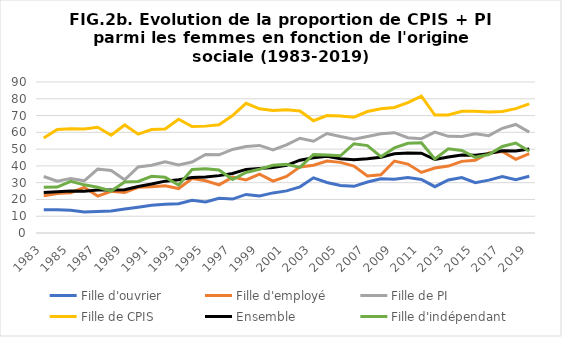
| Category | Fille d'ouvrier | Fille d'employé | Fille de PI | Fille de CPIS | Ensemble | Fille d'indépendant |
|---|---|---|---|---|---|---|
| 1983.0 | 13.8 | 22.2 | 33.7 | 56.6 | 24.1 | 27.3 |
| 1984.0 | 13.8 | 23.5 | 30.9 | 61.7 | 24.6 | 27.4 |
| 1985.0 | 13.5 | 24 | 32.5 | 62.1 | 25.1 | 30.8 |
| 1986.0 | 12.5 | 27.2 | 31.1 | 62 | 24.9 | 28.7 |
| 1987.0 | 12.8 | 22 | 38.1 | 63 | 25.6 | 27.3 |
| 1988.0 | 13.1 | 24.9 | 37.3 | 58.3 | 25.7 | 25 |
| 1989.0 | 14.3 | 24.1 | 31.7 | 64.4 | 25.8 | 30.4 |
| 1990.0 | 15.4 | 27.2 | 39.4 | 58.9 | 27.7 | 30.7 |
| 1991.0 | 16.5 | 27.6 | 40.4 | 61.7 | 29.2 | 33.8 |
| 1992.0 | 17.2 | 28.1 | 42.5 | 62 | 30.9 | 33.3 |
| 1993.0 | 17.4 | 26.5 | 40.5 | 67.8 | 31.7 | 28.6 |
| 1994.0 | 19.5 | 32.4 | 42.3 | 63.5 | 33.1 | 37.9 |
| 1995.0 | 18.5 | 31.1 | 46.8 | 63.7 | 33.4 | 38.3 |
| 1996.0 | 20.7 | 28.7 | 46.6 | 64.5 | 34.2 | 37.6 |
| 1997.0 | 20.2 | 33.3 | 49.8 | 70 | 35.5 | 31.9 |
| 1998.0 | 23 | 31.6 | 51.5 | 77.3 | 37.9 | 36.1 |
| 1999.0 | 22.1 | 35.1 | 52.2 | 74 | 38.5 | 38 |
| 2000.0 | 23.9 | 30.9 | 49.5 | 73 | 39 | 40.4 |
| 2001.0 | 25.1 | 33.7 | 52.5 | 73.5 | 40.3 | 40.9 |
| 2002.0 | 27.5 | 39.4 | 56.5 | 72.7 | 43.4 | 39.1 |
| 2003.0 | 32.9 | 40.4 | 54.7 | 66.9 | 44.9 | 46.8 |
| 2004.0 | 30.1 | 42.9 | 59.3 | 70 | 45.8 | 46.5 |
| 2005.0 | 28.3 | 42.1 | 57.5 | 69.8 | 44.2 | 46 |
| 2006.0 | 27.8 | 39.9 | 55.9 | 69 | 43.7 | 53.2 |
| 2007.0 | 30.4 | 34 | 57.5 | 72.4 | 44.2 | 52.1 |
| 2008.0 | 32.3 | 34.7 | 59.2 | 74 | 45.2 | 45.5 |
| 2009.0 | 32.1 | 42.9 | 59.8 | 74.8 | 47.2 | 50.7 |
| 2010.0 | 33.1 | 41.1 | 56.8 | 77.7 | 47.7 | 53.5 |
| 2011.0 | 31.9 | 36.1 | 56.2 | 81.6 | 47.6 | 53.8 |
| 2012.0 | 27.6 | 38.7 | 60.1 | 70.3 | 43.8 | 44.2 |
| 2013.0 | 31.6 | 39.9 | 57.6 | 70.4 | 45.3 | 50.2 |
| 2014.0 | 33 | 42.7 | 57.5 | 72.5 | 46.5 | 49.2 |
| 2015.0 | 30 | 43.3 | 59.2 | 72.6 | 46.4 | 45.1 |
| 2016.0 | 31.5 | 47.7 | 58 | 72.1 | 47.3 | 46.8 |
| 2017.0 | 33.7 | 48.6 | 62.4 | 72.4 | 49 | 51.6 |
| 2018.0 | 31.7 | 43.9 | 64.7 | 74.1 | 48.9 | 53.6 |
| 2019.0 | 33.8 | 47.3 | 60.1 | 77 | 50.1 | 48.7 |